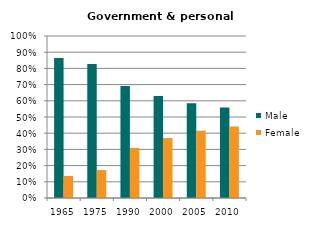
| Category | Male | Female |
|---|---|---|
| 1965.0 | 0.864 | 0.136 |
| 1975.0 | 0.827 | 0.173 |
| 1990.0 | 0.691 | 0.309 |
| 2000.0 | 0.63 | 0.37 |
| 2005.0 | 0.584 | 0.416 |
| 2010.0 | 0.558 | 0.442 |